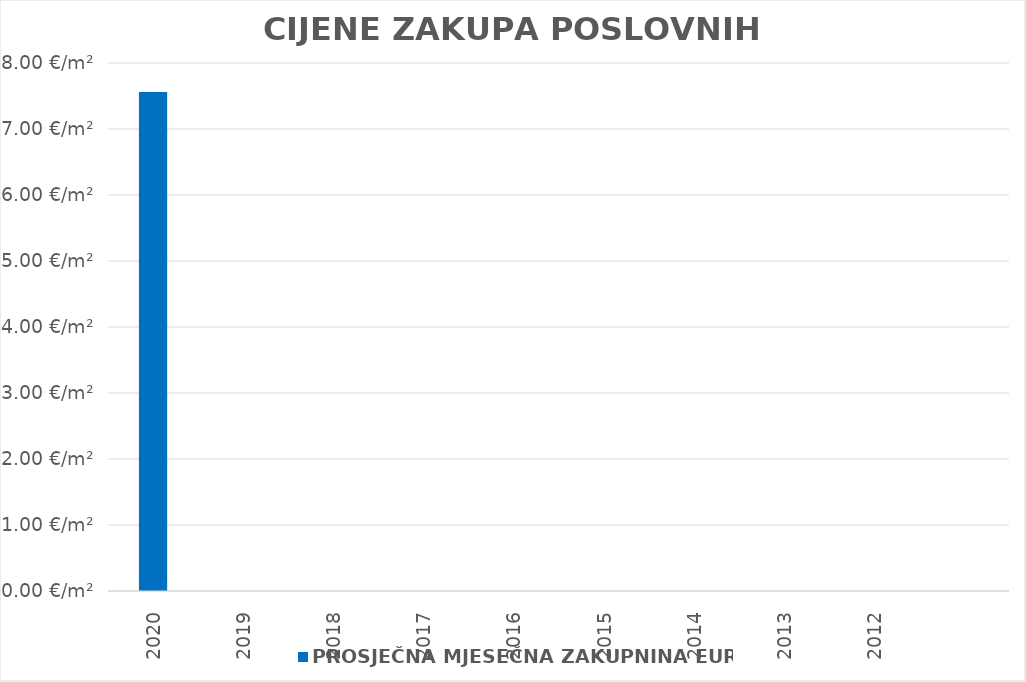
| Category | PROSJEČNA MJESEČNA ZAKUPNINA EUR/m2 |
|---|---|
| 2020 | 1900-01-07 13:26:39 |
| 2019 | 0 |
| 2018 | 0 |
| 2017 | 0 |
| 2016 | 0 |
| 2015 | 0 |
| 2014 | 0 |
| 2013 | 0 |
| 2012 | 0 |